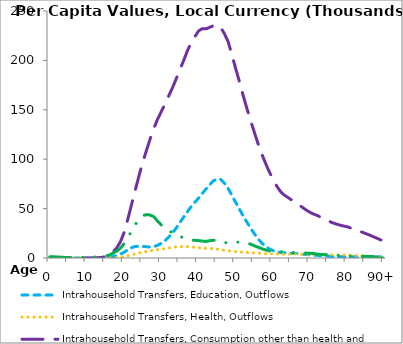
| Category | Intrahousehold Transfers, Education, Outflows | Intrahousehold Transfers, Health, Outflows | Intrahousehold Transfers, Consumption other than health and education, Outflows | Intrahousehold Transfers, Saving, Outflows |
|---|---|---|---|---|
| 0 | 32.795 | 26.953 | 441.871 | 1267.324 |
|  | 27.581 | 19.164 | 339.708 | 1232.252 |
| 2 | 20.058 | 16.012 | 239.79 | 1032.459 |
| 3 | 12.611 | 14.077 | 166.258 | 791.862 |
| 4 | 6.719 | 11.257 | 109.08 | 587.062 |
| 5 | 2.613 | 8.547 | 60.303 | 468.988 |
| 6 | 0.69 | 5.173 | 34.075 | 460.658 |
| 7 | 0.448 | 2.907 | 22.497 | 571.603 |
| 8 | 0.53 | 3.461 | 22.777 | 699.574 |
| 9 | 0.468 | 7.03 | 27.94 | 788.226 |
| 10 | 0.349 | 10.824 | 32.151 | 904.773 |
| 11 | 0.575 | 13.555 | 40.228 | 1044.837 |
| 12 | 1.004 | 34.994 | 96.933 | 1097.738 |
| 13 | 20.137 | 53.263 | 214.302 | 1207.808 |
| 14 | 131.926 | 82.05 | 622.923 | 1469.882 |
| 15 | 370.663 | 139.581 | 1513.618 | 1877.292 |
| 16 | 780.891 | 211.552 | 3188.409 | 2986.995 |
| 17 | 1427.213 | 321.531 | 6047.438 | 4861.868 |
| 18 | 2313.304 | 520.833 | 10256.084 | 6999.135 |
| 19 | 3815.286 | 893.157 | 16429.884 | 9902.372 |
| 20 | 5849.082 | 1504.426 | 25824.482 | 14532.873 |
| 21 | 8309.032 | 2391.906 | 39356.459 | 20492.087 |
| 22 | 10404.32 | 3323.348 | 54286.574 | 27325.055 |
| 23 | 11652.969 | 4178.172 | 68779.312 | 33711.487 |
| 24 | 11965.893 | 5054.847 | 83213.076 | 39316.661 |
| 25 | 11761.68 | 5884.158 | 96853.639 | 42824.502 |
| 26 | 11352.801 | 6599.259 | 108789.806 | 43916.297 |
| 27 | 11122.645 | 7306.438 | 120522.058 | 43490.439 |
| 28 | 11458.321 | 7979.419 | 131293.377 | 41747.902 |
| 29 | 12866.818 | 8470.783 | 140455.938 | 37358.168 |
| 30 | 14869.639 | 8862.55 | 148129.605 | 33483.206 |
| 31 | 17494.825 | 9422.404 | 155776.218 | 30433.296 |
| 32 | 21227.54 | 10107.28 | 164119.701 | 27423.601 |
| 33 | 25365.572 | 10674.736 | 172120.812 | 25767.25 |
| 34 | 30199.651 | 11289.745 | 181240.564 | 24413.62 |
| 35 | 35826.821 | 11634.88 | 190721.99 | 22126.993 |
| 36 | 41302.07 | 11588.657 | 199635.672 | 20212.43 |
| 37 | 46621.686 | 11541.298 | 209545.91 | 18971.767 |
| 38 | 51776.391 | 11191.763 | 217690.042 | 18357.591 |
| 39 | 56239.043 | 10759.033 | 223687.885 | 17868.816 |
| 40 | 60450.084 | 10490.987 | 229640.222 | 17640.605 |
| 41 | 65056.275 | 10107.891 | 232136.289 | 17134.644 |
| 42 | 69661.032 | 9816.991 | 231908.97 | 16772.082 |
| 43 | 74015.765 | 9701.693 | 233388.942 | 17498.575 |
| 44 | 78012.94 | 9474.059 | 235126.999 | 17963.203 |
| 45 | 79958.424 | 9075.144 | 235654.902 | 17560.151 |
| 46 | 79543.216 | 8495.435 | 233228.61 | 16611.713 |
| 47 | 75766.397 | 7838.735 | 227075.181 | 15712.203 |
| 48 | 70341.144 | 7340.555 | 218882.331 | 15264.182 |
| 49 | 63499.412 | 6900.953 | 205923.914 | 15486.522 |
| 50 | 56519.726 | 6520.353 | 192161.292 | 15958.641 |
| 51 | 49805.077 | 6198.146 | 179006.8 | 16128.031 |
| 52 | 42903.991 | 5903.213 | 165001.253 | 15762.085 |
| 53 | 36599.39 | 5630.313 | 151971.658 | 15140.295 |
| 54 | 30495.935 | 5353.127 | 139593.66 | 14074.689 |
| 55 | 24844.915 | 5097.506 | 127953.827 | 12494.461 |
| 56 | 19668.065 | 4820.035 | 116267.256 | 10997.756 |
| 57 | 15280.46 | 4596.15 | 105950.163 | 9522.5 |
| 58 | 11934.91 | 4430.842 | 96497.392 | 8267.332 |
| 59 | 9371.921 | 4299.813 | 87833.23 | 7229.884 |
| 60 | 7587.096 | 4166.676 | 80213.577 | 6589.842 |
| 61 | 6366.369 | 4012.872 | 73322.477 | 6437.228 |
| 62 | 5619.051 | 3875.752 | 67727.797 | 6418.538 |
| 63 | 5252.666 | 3826.09 | 63999.472 | 6213.227 |
| 64 | 5077.729 | 3878.224 | 61449.493 | 5830.622 |
| 65 | 4902.657 | 3958.042 | 58980.15 | 5496.542 |
| 66 | 4652.837 | 3965.583 | 56454.086 | 5326.068 |
| 67 | 4308.382 | 3900.619 | 53783.853 | 5218.146 |
| 68 | 3944.992 | 3784.699 | 51253.343 | 5125.281 |
| 69 | 3540.933 | 3644.571 | 48611.035 | 4966.892 |
| 70 | 3104.099 | 3531.264 | 46254.347 | 4776.901 |
| 71 | 2887.301 | 3528.424 | 44454.618 | 4516.591 |
| 72 | 2712.848 | 3512.644 | 43046.25 | 4019.509 |
| 73 | 2428.699 | 3477.165 | 41068.612 | 3519.885 |
| 74 | 2113.581 | 3416.219 | 39350.423 | 3368.033 |
| 75 | 1839.169 | 3292.029 | 37527.431 | 3236.48 |
| 76 | 1547.732 | 3207.123 | 35839.474 | 3050.716 |
| 77 | 1360.748 | 3117.768 | 34460.468 | 2765.081 |
| 78 | 1245.822 | 3073.979 | 33388.801 | 2442.668 |
| 79 | 1201.472 | 3069.003 | 32435.134 | 2138.677 |
| 80 | 1228.004 | 3054.525 | 31697.08 | 1905.591 |
| 81 | 1247.407 | 2884.773 | 30342.641 | 1853.913 |
| 82 | 1244.776 | 2685.548 | 28926.28 | 1778.661 |
| 83 | 1246.933 | 2492.745 | 27590.319 | 1694.831 |
| 84 | 1278.255 | 2274.772 | 26265.911 | 1688.292 |
| 85 | 1286.898 | 2054.151 | 24794.778 | 1637.843 |
| 86 | 1297.913 | 1828.046 | 23278.719 | 1594.392 |
| 87 | 1308.418 | 1595.246 | 21713.016 | 1557.341 |
| 88 | 1315.547 | 1355.674 | 20095.305 | 0 |
| 89 | 1317.677 | 1110.208 | 18432.363 | 0 |
| 90+ | 1308.774 | 833.785 | 16595.407 | 0 |